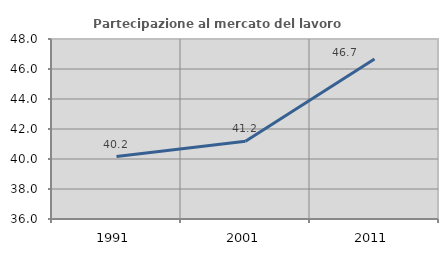
| Category | Partecipazione al mercato del lavoro  femminile |
|---|---|
| 1991.0 | 40.163 |
| 2001.0 | 41.179 |
| 2011.0 | 46.662 |